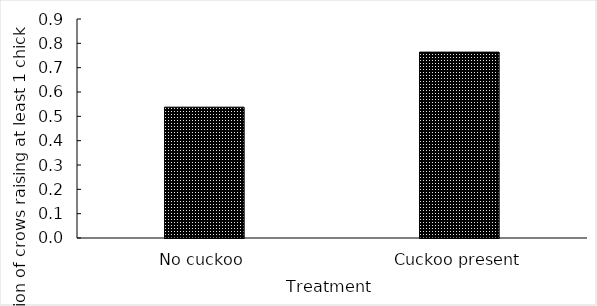
| Category | Series 0 |
|---|---|
| No cuckoo | 0.538 |
| Cuckoo present | 0.764 |